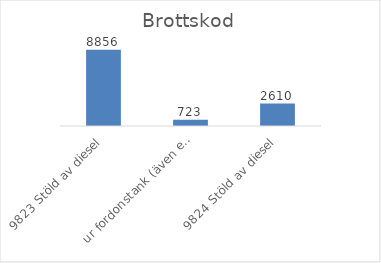
| Category | Summa |
|---|---|
| 9823 Stöld av diesel, ur fordonstank (även entreprenadmaskin m.m.) | 8856 |
| 9824 Stöld av diesel, ur större tankar (ej kopplade till fordon) | 723 |
| 9825 Stöld av drivmedel (även diesel), ej genom smitning | 2610 |